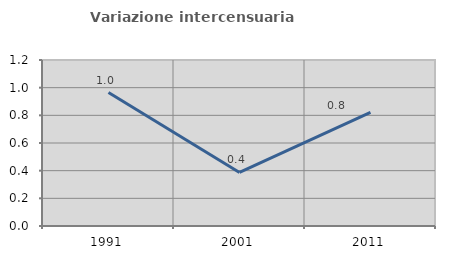
| Category | Variazione intercensuaria annua |
|---|---|
| 1991.0 | 0.965 |
| 2001.0 | 0.387 |
| 2011.0 | 0.822 |